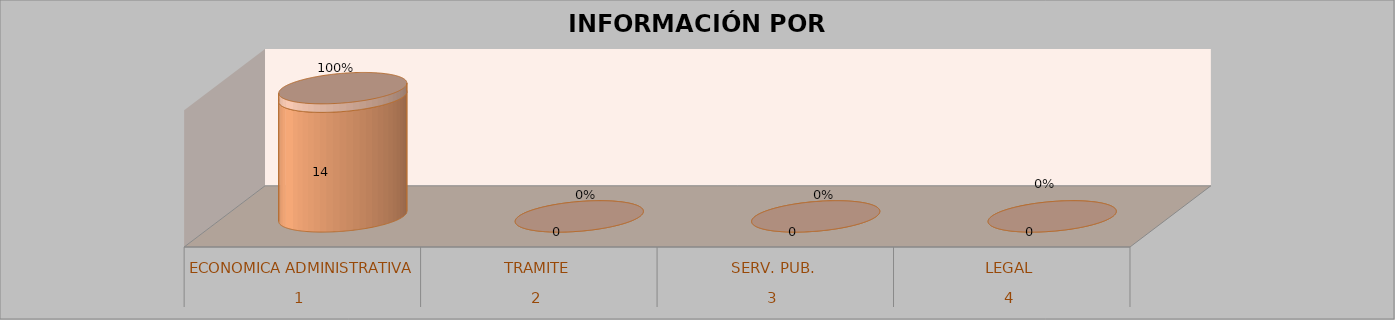
| Category | Series 0 | Series 1 | Series 2 | Series 3 |
|---|---|---|---|---|
| 0 |  |  | 14 | 1 |
| 1 |  |  | 0 | 0 |
| 2 |  |  | 0 | 0 |
| 3 |  |  | 0 | 0 |